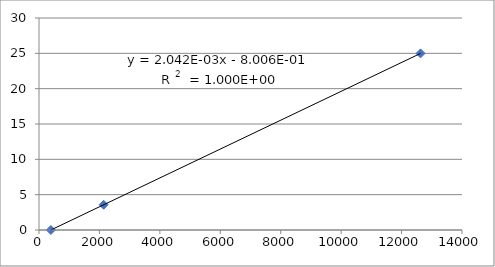
| Category | Series 0 |
|---|---|
| 12628.0 | 24.99 |
| 2140.0 | 3.57 |
| 392.0 | 0 |